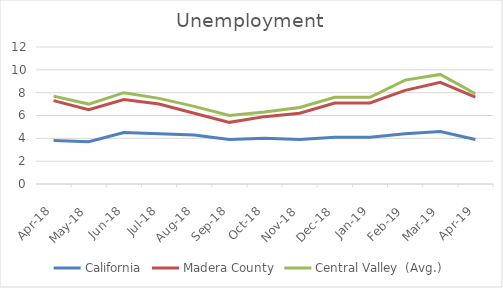
| Category | California | Madera County | Central Valley  (Avg.) |
|---|---|---|---|
| 2018-04-01 | 3.8 | 7.3 | 7.7 |
| 2018-05-01 | 3.7 | 6.5 | 7 |
| 2018-06-01 | 4.5 | 7.4 | 8 |
| 2018-07-01 | 4.4 | 7 | 7.5 |
| 2018-08-01 | 4.3 | 6.2 | 6.8 |
| 2018-09-01 | 3.9 | 5.4 | 6 |
| 2018-10-01 | 4 | 5.9 | 6.3 |
| 2018-11-01 | 3.9 | 6.2 | 6.7 |
| 2018-12-01 | 4.1 | 7.1 | 7.6 |
| 2019-01-01 | 4.1 | 7.1 | 7.6 |
| 2019-02-01 | 4.4 | 8.2 | 9.1 |
| 2019-03-01 | 4.6 | 8.9 | 9.6 |
| 2019-04-01 | 3.9 | 7.6 | 7.9 |